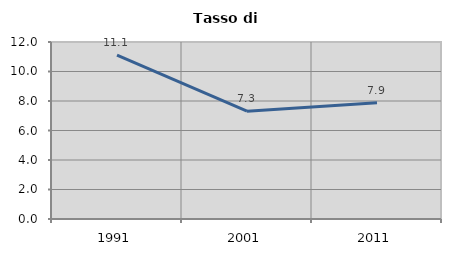
| Category | Tasso di disoccupazione   |
|---|---|
| 1991.0 | 11.109 |
| 2001.0 | 7.307 |
| 2011.0 | 7.878 |